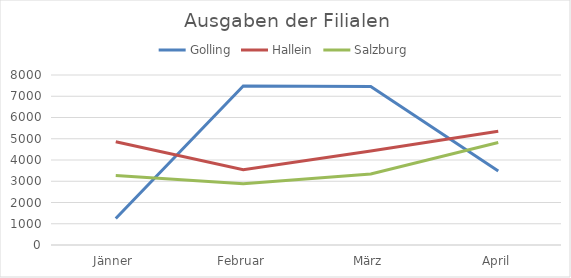
| Category | Golling | Hallein | Salzburg |
|---|---|---|---|
| Jänner | 1244 | 4855 | 3266 |
| Februar | 7488 | 3544 | 2877 |
| März | 7456 | 4421 | 3345 |
| April | 3488 | 5357 | 4822 |